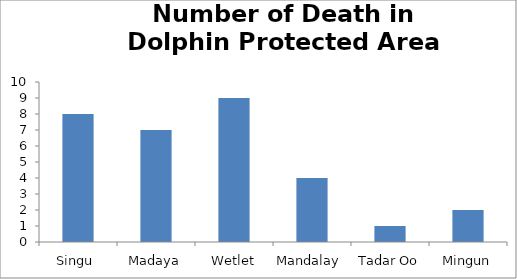
| Category | Number of Death |
|---|---|
| Singu  | 8 |
| Madaya | 7 |
| Wetlet | 9 |
| Mandalay  | 4 |
| Tadar Oo | 1 |
| Mingun | 2 |